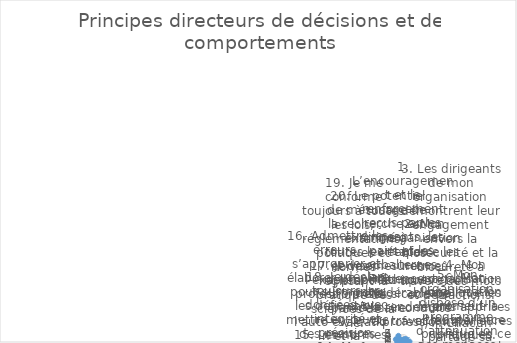
| Category | Series 0 |
|---|---|
| 1. L’encouragement et le renforcement reçus par les dirigeants, les pairs et les subalternes influencent considérablement le rendement au travail. | 1 |
| 2. Mon organisation renforce les normes éthiques et un code de conduite professionnel. | 0 |
| 3. Les dirigeants de mon organisation démontrent leur engagement envers la biosécurité et la biosûreté à travers des mots et des actions. | 2 |
| 4. Mon organisation applique les leçons apprises et les meilleures pratiques. | 3 |
| 5. Mon organisation dispose d’un programme d’atténuation des menaces internes. | 1 |
| 6. Mon organisation promeut la transparence publique en ce qui concerne sa conformité aux exigences de biosécurité et de biosûreté. | 5 |
| 7. Chacun partage sa responsabilité personnelle en matière de de biosécurité et de biosûreté. | 4 |
| 8. Je connais le concept et les implications de la recherche préoccupante à double usage. | 4 |
| 9. Des personnes dûment qualifiées et formées assurent la surveillance de la biosécurité et de la biosûreté. | 2 |
| 10. Lorsqu’un incident ou un quasi-accident se produit, les gens procèdent à un remue-méninge au lieu de se blâmer. La question posée est « qu’est-ce qui a mal tourné ? » pas « qui avait tort ? », en se concentrant sur l’amélioration, pas sur le blâme. | 0 |
| 11. Je considère les implications et les applications possibles de mon travail et l’équilibre entre la recherche de connaissances scientifiques et mes responsabilités éthiques envers la société. | 2 |
| 12. Je suis motivé pour minimiser les risques de mésusage de la science pour la société. | 3 |
| 13. Je suis conscient de la menace du bioterrorisme et des armes biologiques. | 5 |
| 14. Mon organisation a mis en place un code de conduite responsable. | 1 |
| 15. Les normes sont appliquées dans mon organisation. | 4 |
| 16. Admettre les erreurs, s’approprier et élaborer un plan pour surmonter les défis et/ou mettre en œuvre des mesures correctives font partie intégrante d’une biosécurité et d’une biosûreté efficaces. | 1 |
| 17. Je vise l’excellence professionnelle par l’auto-évaluation et la formation continue. | 5 |
| 18. Je déclare toujours les données avec intégrité et précision. | 3 |
| 19. Je me conforme toujours à toutes les lois, réglementations, politiques et normes régissant la pratique des sciences de la vie. | 5 |
| 20. Le potentiel de mésusage de la recherche est examiné à toutes les étapes et des mesures appropriées sont prises si nécessaire. | 0 |